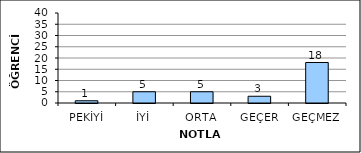
| Category | Series 0 |
|---|---|
| PEKİYİ | 1 |
| İYİ | 5 |
| ORTA | 5 |
| GEÇER | 3 |
| GEÇMEZ | 18 |